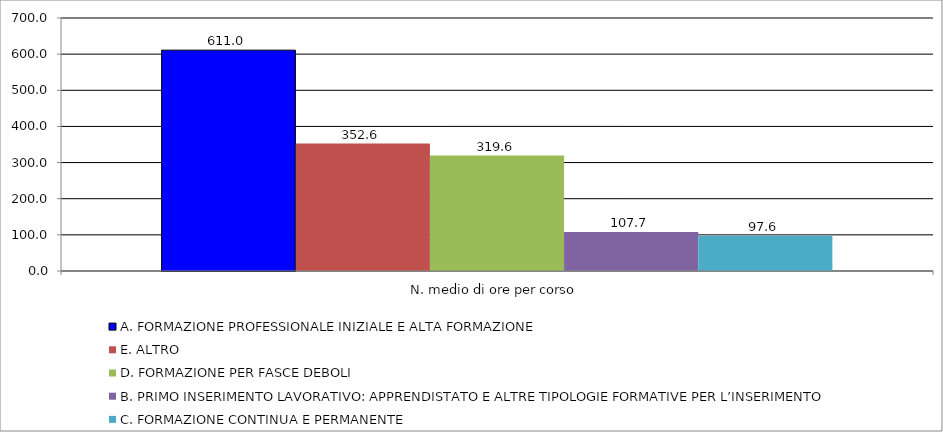
| Category | A. FORMAZIONE PROFESSIONALE INIZIALE E ALTA FORMAZIONE | E. ALTRO | D. FORMAZIONE PER FASCE DEBOLI | B. PRIMO INSERIMENTO LAVORATIVO: APPRENDISTATO E ALTRE TIPOLOGIE FORMATIVE PER L’INSERIMENTO | C. FORMAZIONE CONTINUA E PERMANENTE |
|---|---|---|---|---|---|
| N. medio di ore per corso | 611.049 | 352.631 | 319.563 | 107.667 | 97.588 |